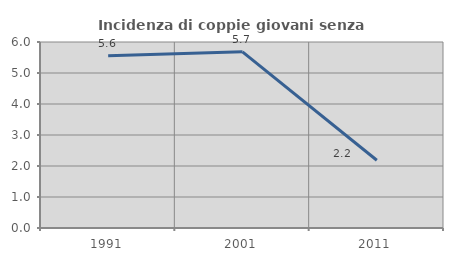
| Category | Incidenza di coppie giovani senza figli |
|---|---|
| 1991.0 | 5.556 |
| 2001.0 | 5.682 |
| 2011.0 | 2.186 |